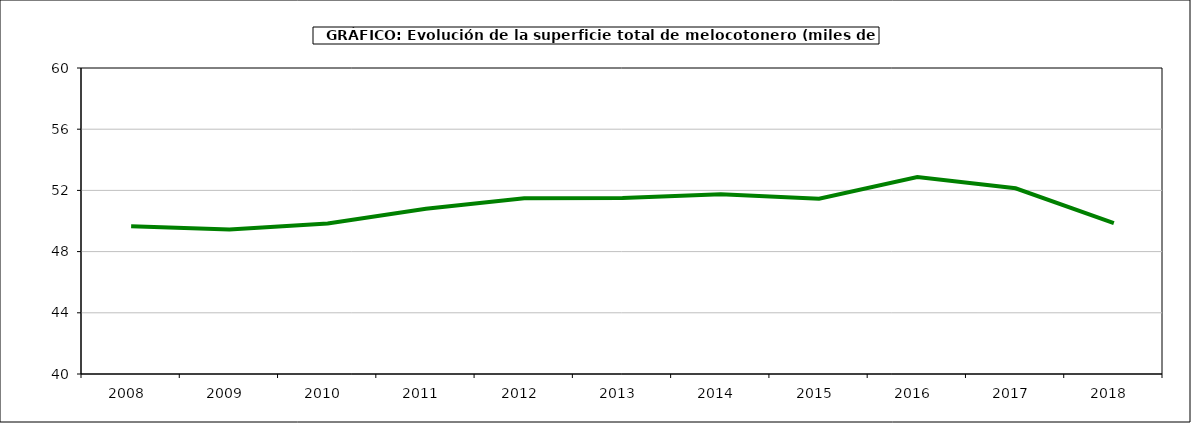
| Category | superficie melocotonero |
|---|---|
| 2008.0 | 49.653 |
| 2009.0 | 49.441 |
| 2010.0 | 49.844 |
| 2011.0 | 50.805 |
| 2012.0 | 51.491 |
| 2013.0 | 51.511 |
| 2014.0 | 51.746 |
| 2015.0 | 51.458 |
| 2016.0 | 52.875 |
| 2017.0 | 52.141 |
| 2018.0 | 49.868 |